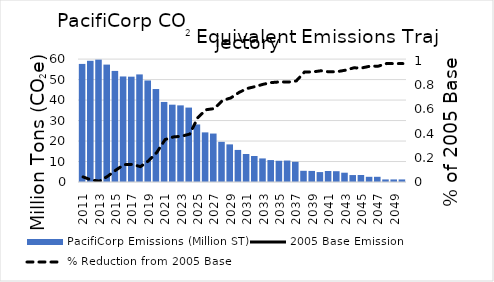
| Category | PacifiCorp Emissions (Million ST) |
|---|---|
| 0 | 57.648 |
| 1 | 59.174 |
| 2 | 59.733 |
| 3 | 57.316 |
| 4 | 54.228 |
| 5 | 51.522 |
| 6 | 51.419 |
| 7 | 52.525 |
| 8 | 49.566 |
| 9 | 45.388 |
| 10 | 39.075 |
| 11 | 37.747 |
| 12 | 37.409 |
| 13 | 36.332 |
| 14 | 28.087 |
| 15 | 24.222 |
| 16 | 23.652 |
| 17 | 19.608 |
| 18 | 18.369 |
| 19 | 15.659 |
| 20 | 13.661 |
| 21 | 12.688 |
| 22 | 11.511 |
| 23 | 10.704 |
| 24 | 10.362 |
| 25 | 10.478 |
| 26 | 9.875 |
| 27 | 5.467 |
| 28 | 5.405 |
| 29 | 4.843 |
| 30 | 5.37 |
| 31 | 5.271 |
| 32 | 4.538 |
| 33 | 3.39 |
| 34 | 3.421 |
| 35 | 2.536 |
| 36 | 2.539 |
| 37 | 1.252 |
| 38 | 1.255 |
| 39 | 1.253 |